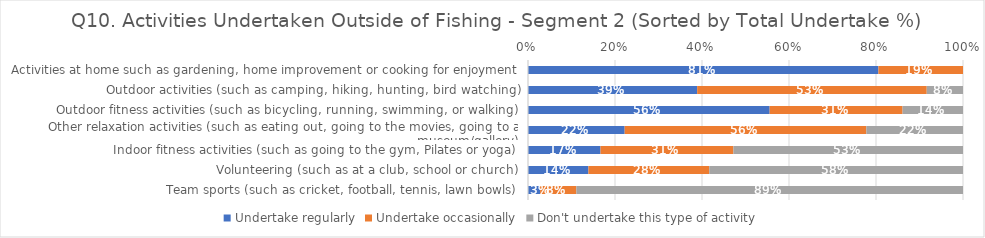
| Category | Undertake regularly | Undertake occasionally | Don't undertake this type of activity |
|---|---|---|---|
| Activities at home such as gardening, home improvement or cooking for enjoyment | 0.806 | 0.194 | 0 |
| Outdoor activities (such as camping, hiking, hunting, bird watching) | 0.389 | 0.528 | 0.083 |
| Outdoor fitness activities (such as bicycling, running, swimming, or walking) | 0.556 | 0.306 | 0.139 |
| Other relaxation activities (such as eating out, going to the movies, going to a museum/gallery) | 0.222 | 0.556 | 0.222 |
| Indoor fitness activities (such as going to the gym, Pilates or yoga) | 0.167 | 0.306 | 0.528 |
| Volunteering (such as at a club, school or church) | 0.139 | 0.278 | 0.583 |
| Team sports (such as cricket, football, tennis, lawn bowls) | 0.028 | 0.083 | 0.889 |